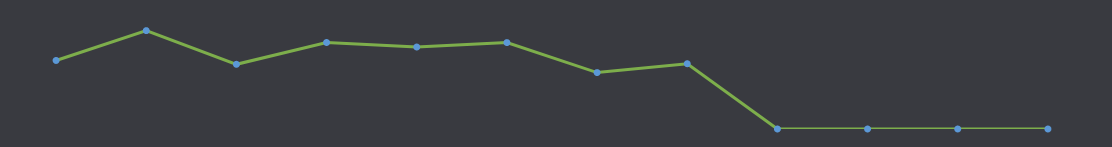
| Category | Liquidités disponibles |
|---|---|
| JANV. | 820 |
| FÉVR. | 1177 |
| MARS | 774 |
| AVR. | 1035 |
| MAI | 981 |
| JUIN | 1034 |
| JUIL. | 675 |
| AOÛT | 781 |
| SEPT. | 0 |
| OCT. | 0 |
| NOV. | 0 |
| DÉC. | 0 |